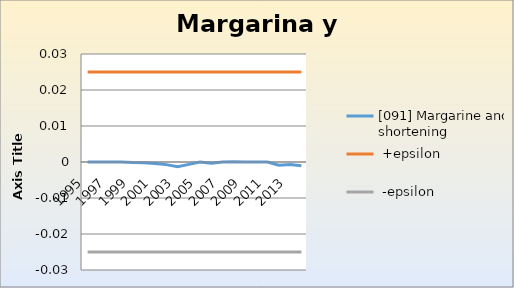
| Category | [091] Margarine and shortening |  +epsilon |  -epsilon |
|---|---|---|---|
| 1995.0 | 0 | 0.025 | -0.025 |
| 1996.0 | 0 | 0.025 | -0.025 |
| 1997.0 | 0 | 0.025 | -0.025 |
| 1998.0 | 0 | 0.025 | -0.025 |
| 1999.0 | 0 | 0.025 | -0.025 |
| 2000.0 | 0 | 0.025 | -0.025 |
| 2001.0 | 0 | 0.025 | -0.025 |
| 2002.0 | -0.001 | 0.025 | -0.025 |
| 2003.0 | -0.001 | 0.025 | -0.025 |
| 2004.0 | -0.001 | 0.025 | -0.025 |
| 2005.0 | 0 | 0.025 | -0.025 |
| 2006.0 | 0 | 0.025 | -0.025 |
| 2007.0 | 0 | 0.025 | -0.025 |
| 2008.0 | 0 | 0.025 | -0.025 |
| 2009.0 | 0 | 0.025 | -0.025 |
| 2010.0 | 0 | 0.025 | -0.025 |
| 2011.0 | 0 | 0.025 | -0.025 |
| 2012.0 | -0.001 | 0.025 | -0.025 |
| 2013.0 | -0.001 | 0.025 | -0.025 |
| 2014.0 | -0.001 | 0.025 | -0.025 |